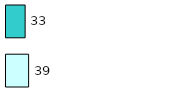
| Category | Series 0 | Series 1 |
|---|---|---|
| 0 | 39 | 33 |